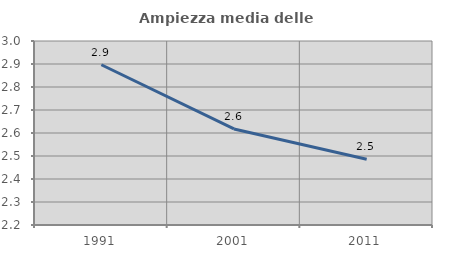
| Category | Ampiezza media delle famiglie |
|---|---|
| 1991.0 | 2.897 |
| 2001.0 | 2.618 |
| 2011.0 | 2.486 |